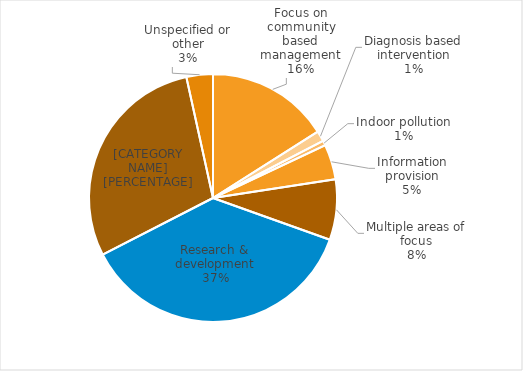
| Category | Series 0 |
|---|---|
| Focus on community based management | 44.065 |
| Diagnosis based intervention | 3.775 |
| Indoor pollution | 1.708 |
| Information provision | 12.575 |
| Multiple areas of focus | 21.718 |
| Research & development | 101.841 |
| Treatment based intervention | 80.058 |
| Unspecified or other | 9.506 |